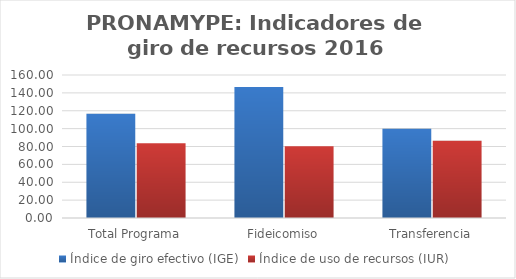
| Category | Índice de giro efectivo (IGE) | Índice de uso de recursos (IUR)  |
|---|---|---|
| Total Programa | 116.729 | 83.672 |
| Fideicomiso | 146.603 | 80.267 |
| Transferencia | 100 | 86.468 |